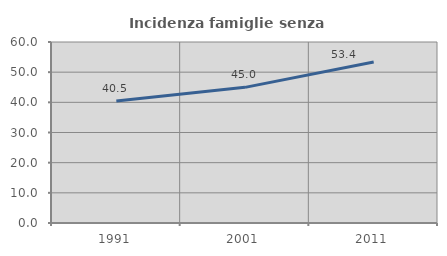
| Category | Incidenza famiglie senza nuclei |
|---|---|
| 1991.0 | 40.459 |
| 2001.0 | 44.962 |
| 2011.0 | 53.381 |